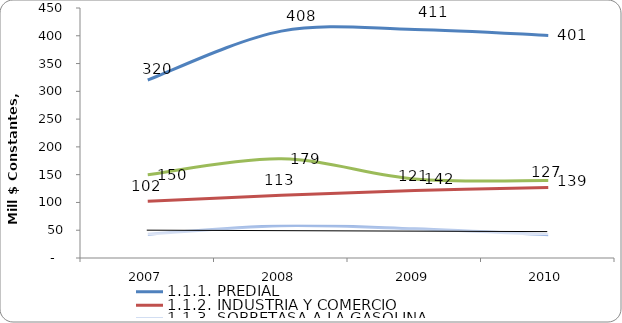
| Category | 1.1.1. PREDIAL | 1.1.2. INDUSTRIA Y COMERCIO | 1.1.3. SOBRETASA A LA GASOLINA | 1.1.4. OTROS |
|---|---|---|---|---|
| 2007 | 320.384 | 102.158 | 42.743 | 149.899 |
| 2008 | 408.409 | 112.75 | 58.207 | 178.592 |
| 2009 | 411.353 | 121.461 | 52.571 | 142.375 |
| 2010 | 400.569 | 127.045 | 41.71 | 139.423 |